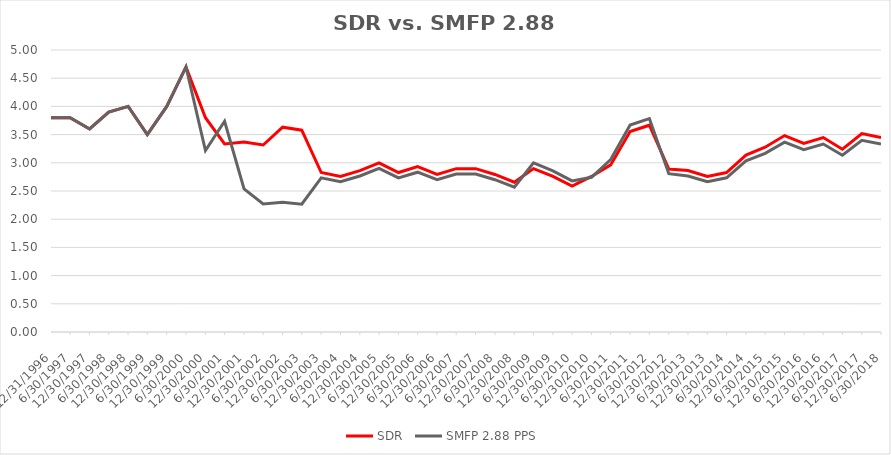
| Category | SDR | SMFP 2.88 PPS |
|---|---|---|
| 12/31/96 | 3.8 | 3.8 |
| 6/30/97 | 3.8 | 3.8 |
| 12/31/97 | 3.6 | 3.6 |
| 6/30/98 | 3.9 | 3.9 |
| 12/31/98 | 4 | 4 |
| 6/30/99 | 3.5 | 3.5 |
| 12/31/99 | 4 | 4 |
| 6/30/00 | 4.7 | 4.7 |
| 12/31/00 | 3.8 | 3.216 |
| 6/30/01 | 3.333 | 3.736 |
| 12/31/01 | 3.368 | 2.536 |
| 6/30/02 | 3.316 | 2.271 |
| 12/31/02 | 3.632 | 2.3 |
| 6/30/03 | 3.579 | 2.267 |
| 12/31/03 | 2.828 | 2.733 |
| 6/30/04 | 2.759 | 2.667 |
| 12/31/04 | 2.862 | 2.767 |
| 6/30/05 | 3 | 2.9 |
| 12/31/05 | 2.828 | 2.733 |
| 6/30/06 | 2.931 | 2.833 |
| 12/31/06 | 2.793 | 2.7 |
| 6/30/07 | 2.897 | 2.8 |
| 12/31/07 | 2.897 | 2.8 |
| 6/30/08 | 2.793 | 2.7 |
| 12/31/08 | 2.655 | 2.567 |
| 6/30/09 | 2.897 | 3 |
| 12/31/09 | 2.759 | 2.857 |
| 6/30/10 | 2.586 | 2.679 |
| 12/31/10 | 2.759 | 2.743 |
| 6/30/11 | 2.963 | 3.057 |
| 12/31/11 | 3.556 | 3.669 |
| 6/30/12 | 3.667 | 3.783 |
| 12/31/12 | 2.889 | 2.808 |
| 6/30/13 | 2.862 | 2.767 |
| 12/31/13 | 2.759 | 2.667 |
| 6/30/14 | 2.828 | 2.733 |
| 12/31/14 | 3.138 | 3.033 |
| 6/30/15 | 3.276 | 3.167 |
| 12/31/15 | 3.483 | 3.367 |
| 6/30/16 | 3.345 | 3.233 |
| 12/31/16 | 3.448 | 3.333 |
| 6/30/17 | 3.241 | 3.133 |
| 12/31/17 | 3.517 | 3.4 |
| 6/30/18 | 3.448 | 3.333 |